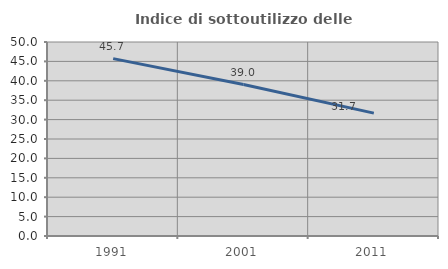
| Category | Indice di sottoutilizzo delle abitazioni  |
|---|---|
| 1991.0 | 45.714 |
| 2001.0 | 39.041 |
| 2011.0 | 31.667 |